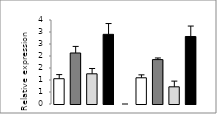
| Category | Series 0 |
|---|---|
|  - | 1.054 |
| HC | 2.125 |